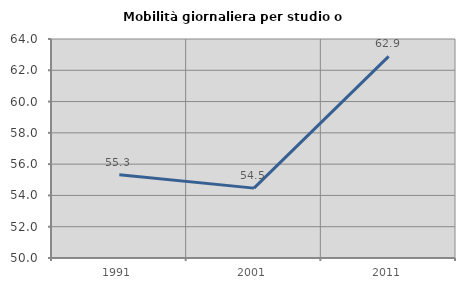
| Category | Mobilità giornaliera per studio o lavoro |
|---|---|
| 1991.0 | 55.318 |
| 2001.0 | 54.467 |
| 2011.0 | 62.889 |